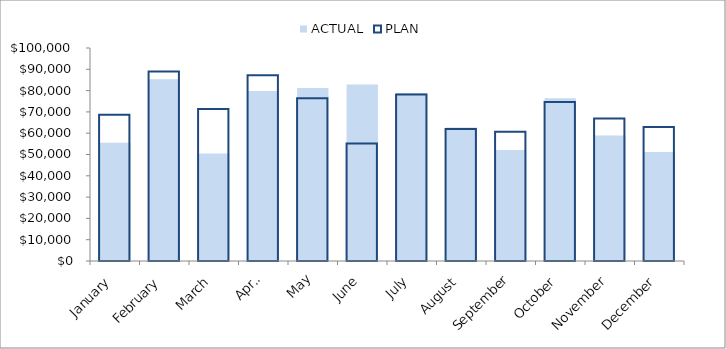
| Category | ACTUAL | PLAN |
|---|---|---|
| January | 55502 | 68606 |
| February | 85296 | 88965 |
| March | 50492 | 71404 |
| April | 79802 | 87253 |
| May | 81254 | 76351 |
| June | 82813 | 55112 |
| July | 78819 | 78153 |
| August | 62645 | 61999 |
| September | 52120 | 60702 |
| October | 76404 | 74693 |
| November | 58896 | 66936 |
| December | 51217 | 62886 |